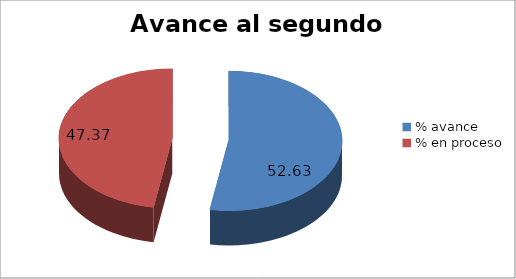
| Category | Series 0 |
|---|---|
| % avance | 52.632 |
| % en proceso | 47.368 |